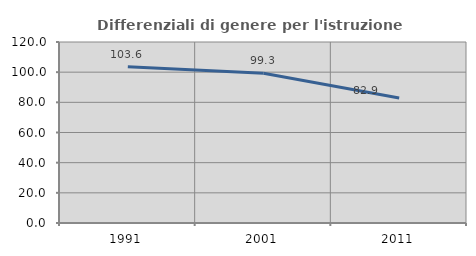
| Category | Differenziali di genere per l'istruzione superiore |
|---|---|
| 1991.0 | 103.553 |
| 2001.0 | 99.256 |
| 2011.0 | 82.927 |